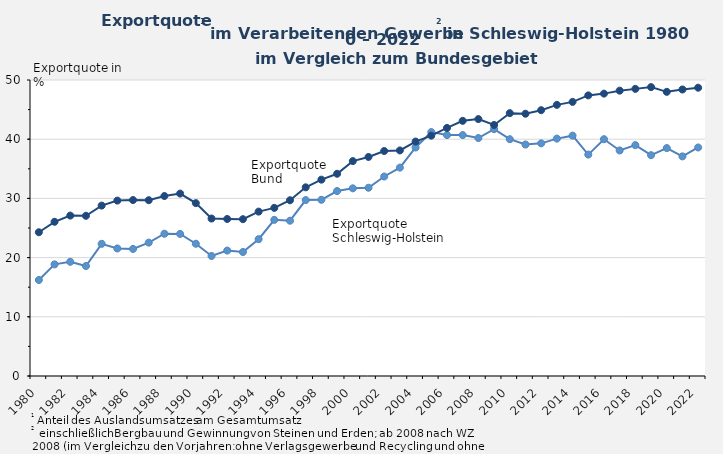
| Category | Exportquote Schleswig-Holstein | Exportquote Bund |
|---|---|---|
| 1980.0 | 16.216 | 24.278 |
| 1981.0 | 18.854 | 26.048 |
| 1982.0 | 19.29 | 27.095 |
| 1983.0 | 18.582 | 27.062 |
| 1984.0 | 22.326 | 28.783 |
| 1985.0 | 21.541 | 29.631 |
| 1986.0 | 21.464 | 29.72 |
| 1987.0 | 22.528 | 29.693 |
| 1988.0 | 24.029 | 30.4 |
| 1989.0 | 24.001 | 30.816 |
| 1990.0 | 22.344 | 29.2 |
| 1991.0 | 20.275 | 26.598 |
| 1992.0 | 21.186 | 26.527 |
| 1993.0 | 20.946 | 26.489 |
| 1994.0 | 23.113 | 27.767 |
| 1995.0 | 26.377 | 28.4 |
| 1996.0 | 26.233 | 29.686 |
| 1997.0 | 29.716 | 31.871 |
| 1998.0 | 29.761 | 33.167 |
| 1999.0 | 31.245 | 34.161 |
| 2000.0 | 31.7 | 36.3 |
| 2001.0 | 31.8 | 37 |
| 2002.0 | 33.7 | 38 |
| 2003.0 | 35.2 | 38.1 |
| 2004.0 | 38.6 | 39.6 |
| 2005.0 | 41.2 | 40.6 |
| 2006.0 | 40.7 | 41.9 |
| 2007.0 | 40.7 | 43.1 |
| 2008.0 | 40.2 | 43.4 |
| 2009.0 | 41.7 | 42.4 |
| 2010.0 | 40 | 44.4 |
| 2011.0 | 39.1 | 44.3 |
| 2012.0 | 39.3 | 44.9 |
| 2013.0 | 40.1 | 45.8 |
| 2014.0 | 40.6 | 46.3 |
| 2015.0 | 37.4 | 47.4 |
| 2016.0 | 40 | 47.7 |
| 2017.0 | 38.1 | 48.2 |
| 2018.0 | 39 | 48.5 |
| 2019.0 | 37.3 | 48.8 |
| 2020.0 | 38.5 | 48 |
| 2021.0 | 37.1 | 48.4 |
| 2022.0 | 38.6 | 48.7 |